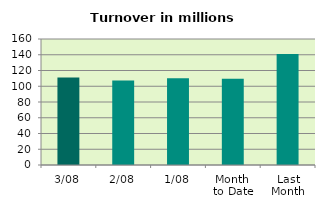
| Category | Series 0 |
|---|---|
| 3/08 | 111.208 |
| 2/08 | 107.352 |
| 1/08 | 110.25 |
| Month 
to Date | 109.603 |
| Last
Month | 140.832 |